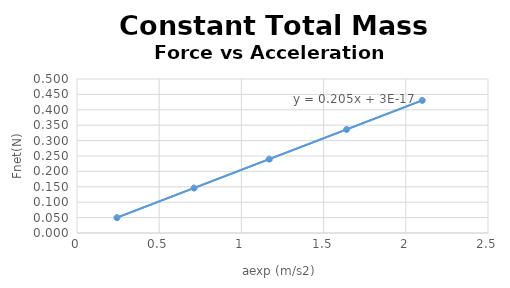
| Category | Series 0 |
|---|---|
| 0.243 | 0.05 |
| 0.712 | 0.146 |
| 1.17 | 0.24 |
| 1.64 | 0.336 |
| 2.1 | 0.431 |